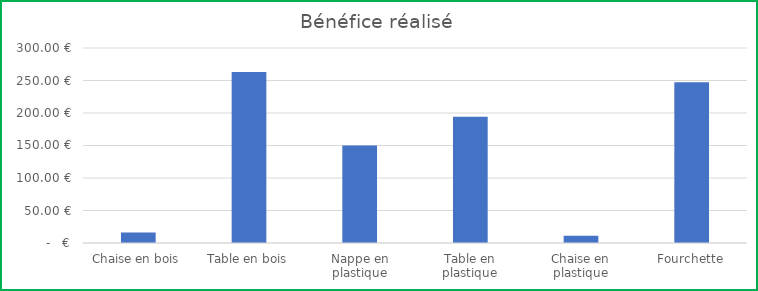
| Category | Bénéfice réalisé |
|---|---|
| Chaise en bois | 16.1 |
| Table en bois | 263.25 |
| Nappe en plastique | 150.15 |
| Table en plastique | 194.37 |
| Chaise en plastique | 11.25 |
| Fourchette | 247.32 |